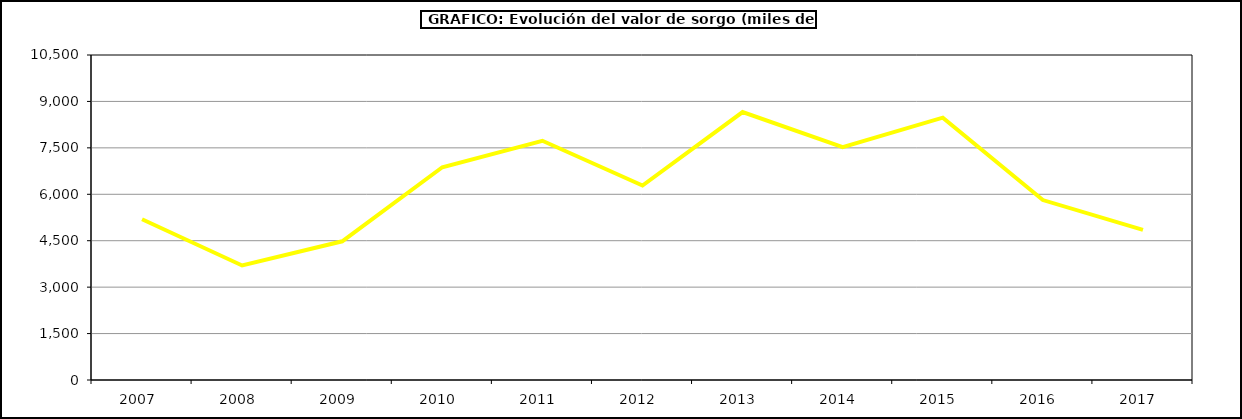
| Category | Producción |
|---|---|
| 2007.0 | 5192.201 |
| 2008.0 | 3699.984 |
| 2009.0 | 4481.299 |
| 2010.0 | 6873.468 |
| 2011.0 | 7728.6 |
| 2012.0 | 6283.71 |
| 2013.0 | 8656.32 |
| 2014.0 | 7525 |
| 2015.0 | 8476 |
| 2016.0 | 5814 |
| 2017.0 | 4849.204 |